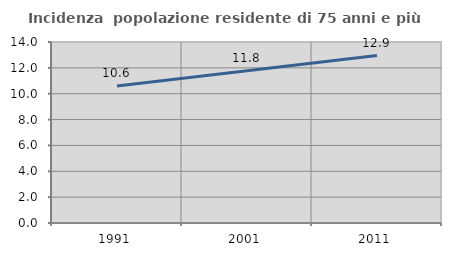
| Category | Incidenza  popolazione residente di 75 anni e più |
|---|---|
| 1991.0 | 10.597 |
| 2001.0 | 11.768 |
| 2011.0 | 12.948 |